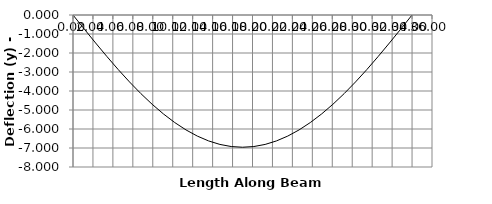
| Category | y |
|---|---|
| 0.0 | 0 |
| 1.1333333333333333 | -0.741 |
| 2.2666666666666666 | -1.472 |
| 3.4 | -2.185 |
| 4.533333333333333 | -2.871 |
| 5.666666666666666 | -3.523 |
| 6.8 | -4.134 |
| 7.933333333333334 | -4.697 |
| 9.066666666666666 | -5.207 |
| 10.2 | -5.659 |
| 11.333333333333332 | -6.049 |
| 12.466666666666667 | -6.373 |
| 13.6 | -6.628 |
| 14.733333333333333 | -6.812 |
| 15.866666666666667 | -6.923 |
| 17.0 | -6.96 |
| 18.133333333333333 | -6.923 |
| 19.266666666666666 | -6.812 |
| 20.4 | -6.628 |
| 21.53333333333333 | -6.373 |
| 22.666666666666664 | -6.049 |
| 23.8 | -5.659 |
| 24.933333333333334 | -5.207 |
| 26.066666666666666 | -4.697 |
| 27.2 | -4.134 |
| 28.333333333333332 | -3.523 |
| 29.466666666666665 | -2.871 |
| 30.599999999999998 | -2.185 |
| 31.733333333333334 | -1.472 |
| 32.86666666666667 | -0.741 |
| 34.0 | 0 |
| 34.0 | 0 |